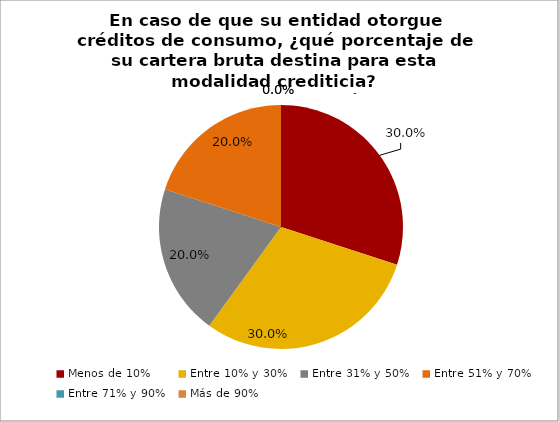
| Category | En caso de que su entidad otorgue créditos de consumo, ¿qué porcentaje de su cartera bruta destina para esta modalidad crediticia? Mercado de microcrédito |
|---|---|
| Menos de 10% | 0.3 |
| Entre 10% y 30% | 0.3 |
| Entre 31% y 50% | 0.2 |
| Entre 51% y 70% | 0.2 |
| Entre 71% y 90% | 0 |
| Más de 90% | 0 |